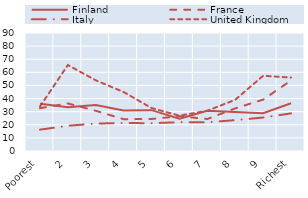
| Category | Finland | France | Italy | United Kingdom |
|---|---|---|---|---|
| Poorest | 36.12 | 32.64 | 16.28 | 33.84 |
| 2 | 33.45 | 36.28 | 19.23 | 65.59 |
| 3 | 35.16 | 30.69 | 20.93 | 53.92 |
| 4 | 30.97 | 24.26 | 21.34 | 44.99 |
| 5 | 31.15 | 24.43 | 21.2 | 32.76 |
| 6 | 24.69 | 26.53 | 21.97 | 26.91 |
| 7 | 30.62 | 24.41 | 21.89 | 30.72 |
| 8 | 29.66 | 32.51 | 23.54 | 39.09 |
| 9 | 28.84 | 39.21 | 25.52 | 57.38 |
| Richest | 36.47 | 53.8 | 28.69 | 56.02 |